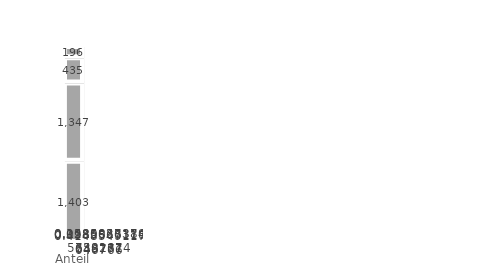
| Category | Deutsche Bundesbank | Federal Reserve Bank (US) | Bank of England | Banque de France |
|---|---|---|---|---|
| Anteil | 1402.5 | 1347.4 | 434.7 | 196.1 |